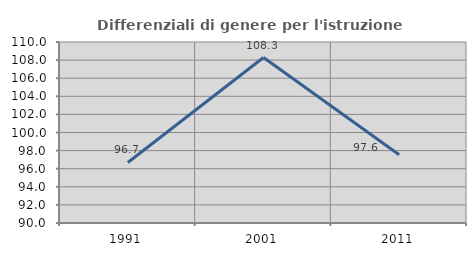
| Category | Differenziali di genere per l'istruzione superiore |
|---|---|
| 1991.0 | 96.689 |
| 2001.0 | 108.283 |
| 2011.0 | 97.551 |